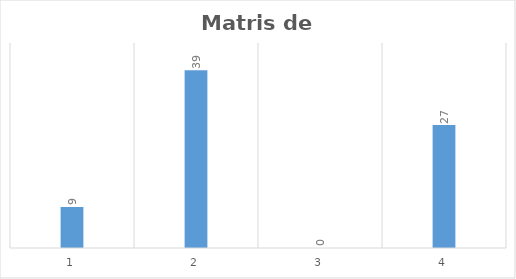
| Category | Series 0 |
|---|---|
| 0 | 9 |
| 1 | 39 |
| 2 | 0 |
| 3 | 27 |